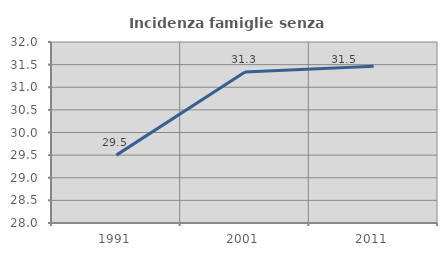
| Category | Incidenza famiglie senza nuclei |
|---|---|
| 1991.0 | 29.5 |
| 2001.0 | 31.336 |
| 2011.0 | 31.466 |